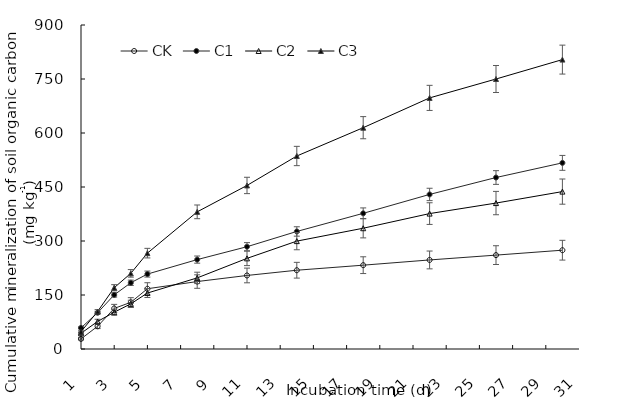
| Category | CK | C1 | C2 | C3 |
|---|---|---|---|---|
| 1.0 | 28.111 | 58.667 | 43.511 | 48.156 |
| 2.0 | 63.067 | 100.711 | 76.511 | 104.133 |
| 3.0 | 112.677 | 150.321 | 102.161 | 170.203 |
| 4.0 | 129.617 | 183.959 | 125.393 | 210.133 |
| 5.0 | 167.369 | 208.159 | 155.401 | 266.276 |
| 8.0 | 187.349 | 248.329 | 197.511 | 380.986 |
| 11.0 | 204.289 | 284.149 | 251.741 | 454.306 |
| 14.0 | 218.809 | 326.499 | 299.661 | 536.106 |
| 18.0 | 232.849 | 376.839 | 335.481 | 614.756 |
| 22.0 | 247.369 | 429.353 | 376.137 | 697.52 |
| 26.0 | 260.784 | 476.306 | 405.364 | 749.983 |
| 30.0 | 274.438 | 517.03 | 437.225 | 803.883 |